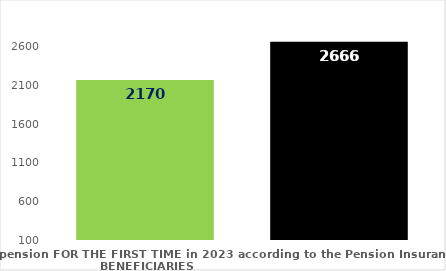
| Category | broj korisnika |
|---|---|
| Pension beneficiaries entitled to pension FOR THE FIRST TIME in 2023 according to the Pension Insurance Act  - NEW BENEFICIARIES | 2170 |
| Pension beneficiaries whose pension entitlement ceased in 2023  -  death caused,   
and who were retired according to the Pension Insurance Act   | 2666 |